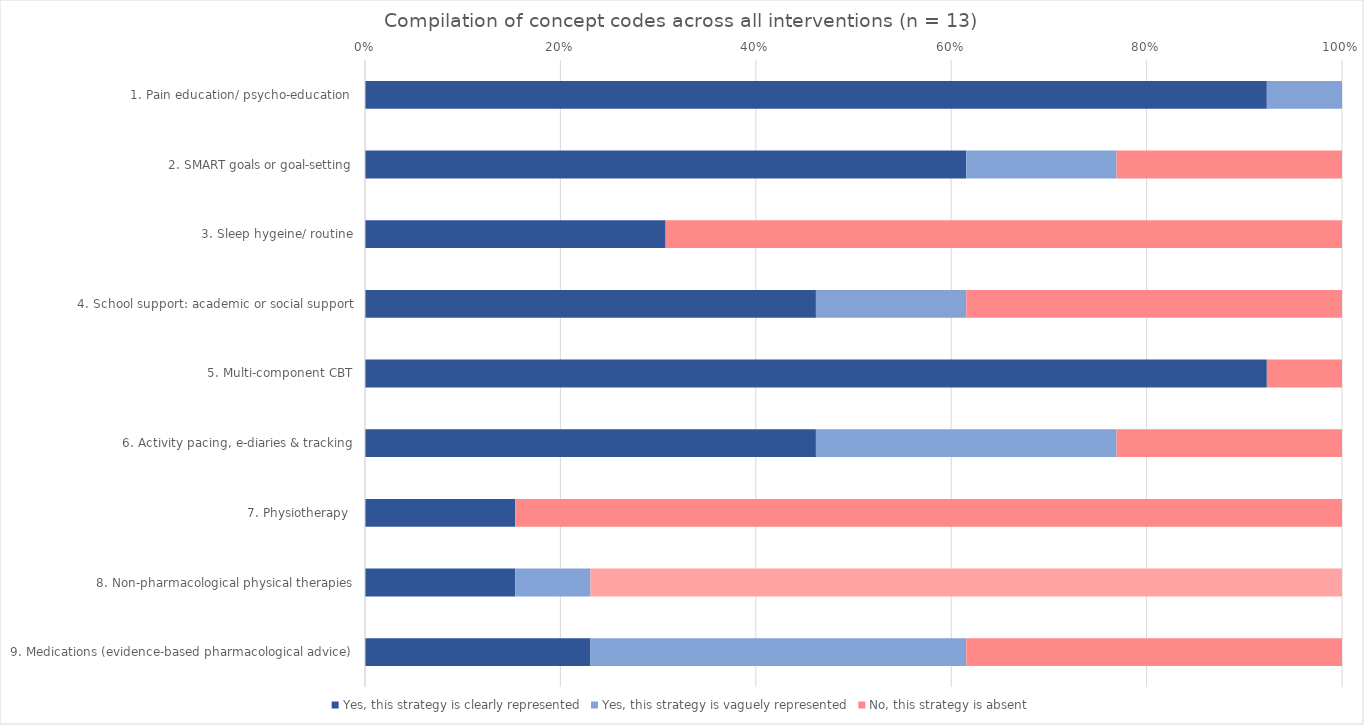
| Category | Yes, this strategy is clearly represented | Yes, this strategy is vaguely represented | No, this strategy is absent |
|---|---|---|---|
| 1. Pain education/ psycho-education  | 12 | 1 | 0 |
| 2. SMART goals or goal-setting | 8 | 2 | 3 |
| 3. Sleep hygeine/ routine | 4 | 0 | 9 |
| 4. School support: academic or social support | 6 | 2 | 5 |
| 5. Multi-component CBT | 12 | 0 | 1 |
| 6. Activity pacing, e-diaries & tracking | 6 | 4 | 3 |
| 7. Physiotherapy  | 2 | 0 | 11 |
| 8. Non-pharmacological physical therapies | 2 | 1 | 10 |
| 9. Medications (evidence-based pharmacological advice) | 3 | 5 | 5 |